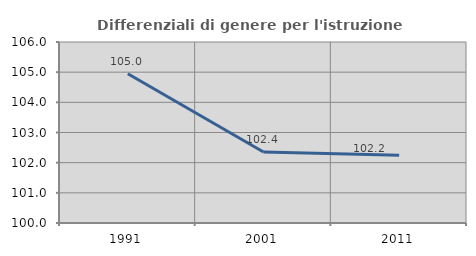
| Category | Differenziali di genere per l'istruzione superiore |
|---|---|
| 1991.0 | 104.95 |
| 2001.0 | 102.351 |
| 2011.0 | 102.246 |